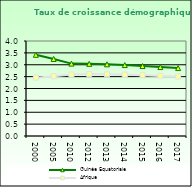
| Category | Guinée Equatoriale | Afrique                        |
|---|---|---|
| 2000.0 | 3.419 | 2.458 |
| 2005.0 | 3.244 | 2.516 |
| 2010.0 | 3.048 | 2.59 |
| 2012.0 | 3.038 | 2.606 |
| 2013.0 | 3.018 | 2.601 |
| 2014.0 | 2.986 | 2.584 |
| 2015.0 | 2.945 | 2.559 |
| 2016.0 | 2.902 | 2.531 |
| 2017.0 | 2.861 | 2.503 |